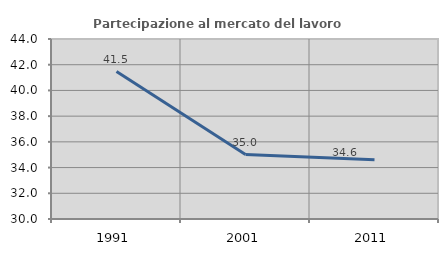
| Category | Partecipazione al mercato del lavoro  femminile |
|---|---|
| 1991.0 | 41.469 |
| 2001.0 | 35.016 |
| 2011.0 | 34.615 |